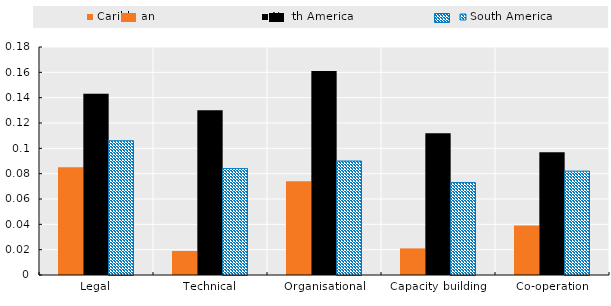
| Category | Caribbean | North America | South America |
|---|---|---|---|
| Legal | 0.085 | 0.143 | 0.106 |
| Technical | 0.019 | 0.13 | 0.084 |
| Organisational | 0.074 | 0.161 | 0.09 |
| Capacity building | 0.021 | 0.112 | 0.073 |
| Co-operation | 0.039 | 0.097 | 0.082 |